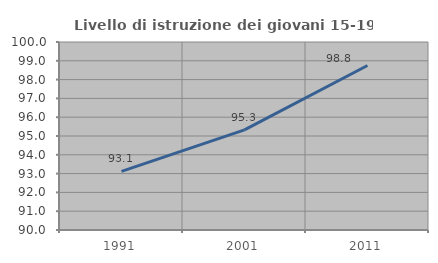
| Category | Livello di istruzione dei giovani 15-19 anni |
|---|---|
| 1991.0 | 93.116 |
| 2001.0 | 95.327 |
| 2011.0 | 98.75 |